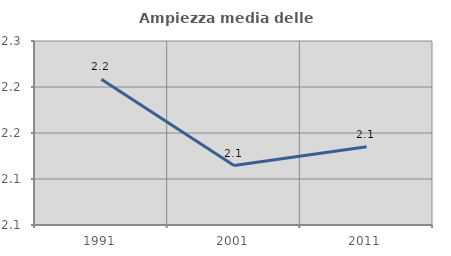
| Category | Ampiezza media delle famiglie |
|---|---|
| 1991.0 | 2.208 |
| 2001.0 | 2.115 |
| 2011.0 | 2.135 |